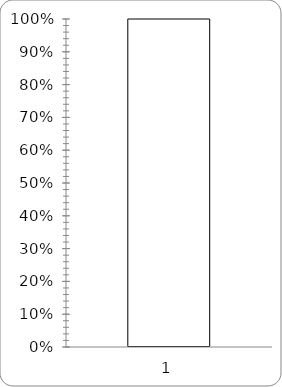
| Category | Achieved: | Target: |
|---|---|---|
| 0 | 0 | 1 |